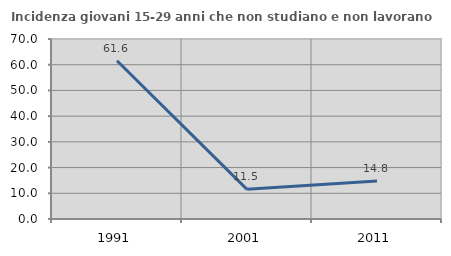
| Category | Incidenza giovani 15-29 anni che non studiano e non lavorano  |
|---|---|
| 1991.0 | 61.55 |
| 2001.0 | 11.523 |
| 2011.0 | 14.771 |